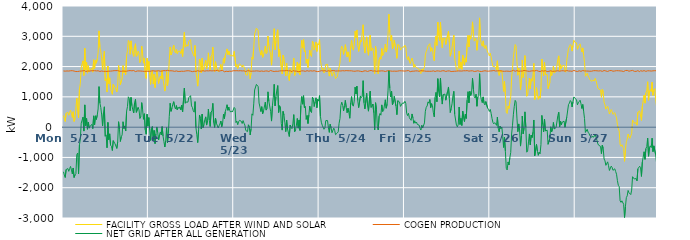
| Category | FACILITY GROSS LOAD AFTER WIND AND SOLAR | COGEN PRODUCTION | NET GRID AFTER ALL GENERATION |
|---|---|---|---|
|  Mon  5/21 | 381 | 1855 | -1474 |
|  Mon  5/21 | 284 | 1862 | -1578 |
|  Mon  5/21 | 187 | 1849 | -1662 |
|  Mon  5/21 | 459 | 1859 | -1400 |
|  Mon  5/21 | 466 | 1855 | -1389 |
|  Mon  5/21 | 488 | 1856 | -1368 |
|  Mon  5/21 | 393 | 1852 | -1459 |
|  Mon  5/21 | 490 | 1856 | -1366 |
|  Mon  5/21 | 565 | 1862 | -1297 |
|  Mon  5/21 | 443 | 1862 | -1419 |
|  Mon  5/21 | 321 | 1864 | -1543 |
|  Mon  5/21 | 509 | 1858 | -1349 |
|  Mon  5/21 | 189 | 1851 | -1662 |
|  Mon  5/21 | 278 | 1855 | -1577 |
|  Mon  5/21 | 300 | 1836 | -1536 |
|  Mon  5/21 | 953 | 1861 | -908 |
|  Mon  5/21 | 983 | 1837 | -854 |
|  Mon  5/21 | 306 | 1846 | -1540 |
|  Mon  5/21 | 1262 | 1847 | -585 |
|  Mon  5/21 | 1442 | 1836 | -394 |
|  Mon  5/21 | 1984 | 1852 | 132 |
|  Mon  5/21 | 2089 | 1857 | 232 |
|  Mon  5/21 | 2190 | 1859 | 331 |
|  Mon  5/21 | 1706 | 1836 | -130 |
|  Mon  5/21 | 2603 | 1868 | 735 |
|  Mon  5/21 | 1881 | 1834 | 47 |
|  Mon  5/21 | 2145 | 1858 | 287 |
|  Mon  5/21 | 1782 | 1852 | -70 |
|  Mon  5/21 | 2028 | 1860 | 168 |
|  Mon  5/21 | 1820 | 1853 | -33 |
|  Mon  5/21 | 1887 | 1853 | 34 |
|  Mon  5/21 | 1921 | 1858 | 63 |
|  Mon  5/21 | 1955 | 1866 | 89 |
|  Mon  5/21 | 1816 | 1866 | -50 |
|  Mon  5/21 | 2226 | 1853 | 373 |
|  Mon  5/21 | 1936 | 1864 | 72 |
|  Mon  5/21 | 2207 | 1833 | 374 |
|  Mon  5/21 | 2111 | 1857 | 254 |
|  Mon  5/21 | 2253 | 1857 | 396 |
|  Mon  5/21 | 2461 | 1861 | 600 |
|  Mon  5/21 | 3179 | 1841 | 1338 |
|  Mon  5/21 | 2633 | 1839 | 794 |
|  Mon  5/21 | 2508 | 1859 | 649 |
|  Mon  5/21 | 2255 | 1853 | 402 |
|  Mon  5/21 | 1891 | 1854 | 37 |
|  Mon  5/21 | 2311 | 1843 | 468 |
|  Mon  5/21 | 2511 | 1839 | 672 |
|  Mon  5/21 | 1541 | 1842 | -301 |
|  Mon  5/21 | 1598 | 1854 | -256 |
|  Mon  5/21 | 1159 | 1840 | -681 |
|  Mon  5/21 | 2019 | 1863 | 156 |
|  Mon  5/21 | 1434 | 1849 | -415 |
|  Mon  5/21 | 1627 | 1848 | -221 |
|  Mon  5/21 | 1253 | 1850 | -597 |
|  Mon  5/21 | 1220 | 1853 | -633 |
|  Mon  5/21 | 1085 | 1856 | -771 |
|  Mon  5/21 | 1417 | 1861 | -444 |
|  Mon  5/21 | 1424 | 1865 | -441 |
|  Mon  5/21 | 1314 | 1863 | -549 |
|  Mon  5/21 | 1326 | 1866 | -540 |
|  Mon  5/21 | 1162 | 1865 | -703 |
|  Mon  5/21 | 1374 | 1867 | -493 |
|  Mon  5/21 | 2040 | 1861 | 179 |
|  Mon  5/21 | 1783 | 1848 | -65 |
|  Mon  5/21 | 1401 | 1875 | -474 |
|  Mon  5/21 | 1523 | 1844 | -321 |
|  Mon  5/21 | 1589 | 1845 | -256 |
|  Mon  5/21 | 2032 | 1854 | 178 |
|  Mon  5/21 | 1793 | 1838 | -45 |
|  Mon  5/21 | 1886 | 1846 | 40 |
|  Mon  5/21 | 1734 | 1862 | -128 |
|  Mon  5/21 | 2368 | 1847 | 521 |
|  Mon  5/21 | 2520 | 1842 | 678 |
|  Mon  5/21 | 2863 | 1861 | 1002 |
|  Mon  5/21 | 2810 | 1856 | 954 |
|  Mon  5/21 | 2408 | 1867 | 541 |
|  Mon  5/21 | 2848 | 1866 | 982 |
|  Mon  5/21 | 2566 | 1860 | 706 |
|  Mon  5/21 | 2430 | 1859 | 571 |
|  Mon  5/21 | 2337 | 1869 | 468 |
|  Mon  5/21 | 2662 | 1853 | 809 |
|  Mon  5/21 | 2753 | 1835 | 918 |
|  Mon  5/21 | 2336 | 1847 | 489 |
|  Mon  5/21 | 2372 | 1854 | 518 |
|  Mon  5/21 | 2509 | 1857 | 652 |
|  Mon  5/21 | 2424 | 1855 | 569 |
|  Mon  5/21 | 2135 | 1847 | 288 |
|  Mon  5/21 | 2207 | 1852 | 355 |
|  Mon  5/21 | 2677 | 1868 | 809 |
|  Mon  5/21 | 2426 | 1847 | 579 |
|  Mon  5/21 | 2113 | 1853 | 260 |
|  Mon  5/21 | 2284 | 1841 | 443 |
|  Mon  5/21 | 1768 | 1857 | -89 |
|  Mon  5/21 | 1609 | 1844 | -235 |
|  Mon  5/21 | 2277 | 1849 | 428 |
|  Mon  5/21 | 1873 | 1844 | 29 |
|  Tue  5/22 | 2170 | 1855 | 315 |
|  Tue  5/22 | 1755 | 1843 | -88 |
|  Tue  5/22 | 1413 | 1852 | -439 |
|  Tue  5/22 | 1816 | 1855 | -39 |
|  Tue  5/22 | 1872 | 1850 | 22 |
|  Tue  5/22 | 1426 | 1862 | -436 |
|  Tue  5/22 | 1746 | 1854 | -108 |
|  Tue  5/22 | 1307 | 1850 | -543 |
|  Tue  5/22 | 1626 | 1845 | -219 |
|  Tue  5/22 | 1860 | 1854 | 6 |
|  Tue  5/22 | 1682 | 1859 | -177 |
|  Tue  5/22 | 1439 | 1863 | -424 |
|  Tue  5/22 | 1604 | 1854 | -250 |
|  Tue  5/22 | 1688 | 1846 | -158 |
|  Tue  5/22 | 1587 | 1847 | -260 |
|  Tue  5/22 | 1871 | 1854 | 17 |
|  Tue  5/22 | 1568 | 1861 | -293 |
|  Tue  5/22 | 1387 | 1866 | -479 |
|  Tue  5/22 | 1191 | 1847 | -656 |
|  Tue  5/22 | 1420 | 1861 | -441 |
|  Tue  5/22 | 1832 | 1848 | -16 |
|  Tue  5/22 | 1361 | 1875 | -514 |
|  Tue  5/22 | 1625 | 1846 | -221 |
|  Tue  5/22 | 2215 | 1860 | 355 |
|  Tue  5/22 | 2647 | 1859 | 788 |
|  Tue  5/22 | 2383 | 1861 | 522 |
|  Tue  5/22 | 2468 | 1843 | 625 |
|  Tue  5/22 | 2615 | 1856 | 759 |
|  Tue  5/22 | 2710 | 1869 | 841 |
|  Tue  5/22 | 2516 | 1842 | 674 |
|  Tue  5/22 | 2457 | 1858 | 599 |
|  Tue  5/22 | 2569 | 1856 | 713 |
|  Tue  5/22 | 2429 | 1859 | 570 |
|  Tue  5/22 | 2497 | 1839 | 658 |
|  Tue  5/22 | 2477 | 1863 | 614 |
|  Tue  5/22 | 2511 | 1840 | 671 |
|  Tue  5/22 | 2429 | 1860 | 569 |
|  Tue  5/22 | 2575 | 1847 | 728 |
|  Tue  5/22 | 2333 | 1832 | 501 |
|  Tue  5/22 | 2350 | 1843 | 507 |
|  Tue  5/22 | 3133 | 1844 | 1289 |
|  Tue  5/22 | 2641 | 1852 | 789 |
|  Tue  5/22 | 2677 | 1847 | 830 |
|  Tue  5/22 | 2720 | 1862 | 858 |
|  Tue  5/22 | 2671 | 1846 | 825 |
|  Tue  5/22 | 2835 | 1861 | 974 |
|  Tue  5/22 | 2810 | 1839 | 971 |
|  Tue  5/22 | 2888 | 1849 | 1039 |
|  Tue  5/22 | 2555 | 1853 | 702 |
|  Tue  5/22 | 2483 | 1833 | 650 |
|  Tue  5/22 | 2402 | 1860 | 542 |
|  Tue  5/22 | 2342 | 1847 | 495 |
|  Tue  5/22 | 2698 | 1854 | 844 |
|  Tue  5/22 | 1824 | 1841 | -17 |
|  Tue  5/22 | 1605 | 1856 | -251 |
|  Tue  5/22 | 1354 | 1864 | -510 |
|  Tue  5/22 | 1779 | 1861 | -82 |
|  Tue  5/22 | 2247 | 1846 | 401 |
|  Tue  5/22 | 2132 | 1848 | 284 |
|  Tue  5/22 | 1788 | 1850 | -62 |
|  Tue  5/22 | 2278 | 1847 | 431 |
|  Tue  5/22 | 1850 | 1863 | -13 |
|  Tue  5/22 | 1940 | 1856 | 84 |
|  Tue  5/22 | 2101 | 1850 | 251 |
|  Tue  5/22 | 2205 | 1865 | 340 |
|  Tue  5/22 | 1930 | 1862 | 68 |
|  Tue  5/22 | 2073 | 1864 | 209 |
|  Tue  5/22 | 2453 | 1857 | 596 |
|  Tue  5/22 | 2085 | 1856 | 229 |
|  Tue  5/22 | 1886 | 1864 | 22 |
|  Tue  5/22 | 2339 | 1841 | 498 |
|  Tue  5/22 | 2391 | 1857 | 534 |
|  Tue  5/22 | 2642 | 1857 | 785 |
|  Tue  5/22 | 2011 | 1863 | 148 |
|  Tue  5/22 | 1838 | 1846 | -8 |
|  Tue  5/22 | 2160 | 1862 | 298 |
|  Tue  5/22 | 1985 | 1854 | 131 |
|  Tue  5/22 | 1997 | 1878 | 119 |
|  Tue  5/22 | 1834 | 1859 | -25 |
|  Tue  5/22 | 1892 | 1849 | 43 |
|  Tue  5/22 | 1948 | 1846 | 102 |
|  Tue  5/22 | 2068 | 1865 | 203 |
|  Tue  5/22 | 1872 | 1858 | 14 |
|  Tue  5/22 | 2003 | 1871 | 132 |
|  Tue  5/22 | 2283 | 1852 | 431 |
|  Tue  5/22 | 2113 | 1830 | 283 |
|  Tue  5/22 | 2372 | 1861 | 511 |
|  Tue  5/22 | 2461 | 1845 | 616 |
|  Tue  5/22 | 2583 | 1844 | 739 |
|  Tue  5/22 | 2394 | 1838 | 556 |
|  Tue  5/22 | 2515 | 1854 | 661 |
|  Tue  5/22 | 2396 | 1847 | 549 |
|  Tue  5/22 | 2342 | 1846 | 496 |
|  Tue  5/22 | 2379 | 1844 | 535 |
|  Tue  5/22 | 2360 | 1862 | 498 |
|  Tue  5/22 | 2338 | 1863 | 475 |
|  Wed  5/23 | 2503 | 1853 | 650 |
|  Wed  5/23 | 2472 | 1861 | 611 |
|  Wed  5/23 | 1994 | 1844 | 150 |
|  Wed  5/23 | 2066 | 1864 | 202 |
|  Wed  5/23 | 1937 | 1857 | 80 |
|  Wed  5/23 | 2038 | 1859 | 179 |
|  Wed  5/23 | 2091 | 1867 | 224 |
|  Wed  5/23 | 2103 | 1864 | 239 |
|  Wed  5/23 | 2037 | 1842 | 195 |
|  Wed  5/23 | 1976 | 1856 | 120 |
|  Wed  5/23 | 2056 | 1840 | 216 |
|  Wed  5/23 | 1992 | 1860 | 132 |
|  Wed  5/23 | 1913 | 1843 | 70 |
|  Wed  5/23 | 1728 | 1836 | -108 |
|  Wed  5/23 | 1728 | 1840 | -112 |
|  Wed  5/23 | 1716 | 1864 | -148 |
|  Wed  5/23 | 1930 | 1853 | 77 |
|  Wed  5/23 | 1863 | 1858 | 5 |
|  Wed  5/23 | 1596 | 1853 | -257 |
|  Wed  5/23 | 1793 | 1845 | -52 |
|  Wed  5/23 | 2305 | 1866 | 439 |
|  Wed  5/23 | 2243 | 1851 | 392 |
|  Wed  5/23 | 2630 | 1862 | 768 |
|  Wed  5/23 | 3078 | 1851 | 1227 |
|  Wed  5/23 | 3089 | 1876 | 1213 |
|  Wed  5/23 | 3269 | 1858 | 1411 |
|  Wed  5/23 | 3245 | 1843 | 1402 |
|  Wed  5/23 | 3190 | 1853 | 1337 |
|  Wed  5/23 | 2647 | 1851 | 796 |
|  Wed  5/23 | 2510 | 1844 | 666 |
|  Wed  5/23 | 2376 | 1859 | 517 |
|  Wed  5/23 | 2529 | 1854 | 675 |
|  Wed  5/23 | 2306 | 1864 | 442 |
|  Wed  5/23 | 2379 | 1841 | 538 |
|  Wed  5/23 | 2350 | 1844 | 506 |
|  Wed  5/23 | 2677 | 1853 | 824 |
|  Wed  5/23 | 2428 | 1866 | 562 |
|  Wed  5/23 | 2464 | 1855 | 609 |
|  Wed  5/23 | 3009 | 1843 | 1166 |
|  Wed  5/23 | 2689 | 1838 | 851 |
|  Wed  5/23 | 2721 | 1839 | 882 |
|  Wed  5/23 | 2392 | 1870 | 522 |
|  Wed  5/23 | 2047 | 1847 | 200 |
|  Wed  5/23 | 2552 | 1849 | 703 |
|  Wed  5/23 | 2860 | 1868 | 992 |
|  Wed  5/23 | 3251 | 1837 | 1414 |
|  Wed  5/23 | 2560 | 1856 | 704 |
|  Wed  5/23 | 2844 | 1847 | 997 |
|  Wed  5/23 | 3091 | 1868 | 1223 |
|  Wed  5/23 | 3216 | 1843 | 1373 |
|  Wed  5/23 | 2331 | 1847 | 484 |
|  Wed  5/23 | 2563 | 1854 | 709 |
|  Wed  5/23 | 2532 | 1864 | 668 |
|  Wed  5/23 | 1977 | 1860 | 117 |
|  Wed  5/23 | 1755 | 1853 | -98 |
|  Wed  5/23 | 2379 | 1859 | 520 |
|  Wed  5/23 | 2264 | 1866 | 398 |
|  Wed  5/23 | 2002 | 1860 | 142 |
|  Wed  5/23 | 1692 | 1840 | -148 |
|  Wed  5/23 | 2108 | 1873 | 235 |
|  Wed  5/23 | 1797 | 1859 | -62 |
|  Wed  5/23 | 1781 | 1859 | -78 |
|  Wed  5/23 | 1538 | 1846 | -308 |
|  Wed  5/23 | 1930 | 1860 | 70 |
|  Wed  5/23 | 1852 | 1854 | -2 |
|  Wed  5/23 | 1780 | 1831 | -51 |
|  Wed  5/23 | 1974 | 1866 | 108 |
|  Wed  5/23 | 2280 | 1867 | 413 |
|  Wed  5/23 | 1704 | 1853 | -149 |
|  Wed  5/23 | 1756 | 1845 | -89 |
|  Wed  5/23 | 1918 | 1849 | 69 |
|  Wed  5/23 | 2147 | 1861 | 286 |
|  Wed  5/23 | 1799 | 1833 | -34 |
|  Wed  5/23 | 2093 | 1856 | 237 |
|  Wed  5/23 | 1729 | 1838 | -109 |
|  Wed  5/23 | 2551 | 1839 | 712 |
|  Wed  5/23 | 2870 | 1859 | 1011 |
|  Wed  5/23 | 2610 | 1852 | 758 |
|  Wed  5/23 | 2895 | 1856 | 1039 |
|  Wed  5/23 | 2486 | 1848 | 638 |
|  Wed  5/23 | 2529 | 1843 | 686 |
|  Wed  5/23 | 2108 | 1853 | 255 |
|  Wed  5/23 | 2247 | 1864 | 383 |
|  Wed  5/23 | 1970 | 1850 | 120 |
|  Wed  5/23 | 2253 | 1848 | 405 |
|  Wed  5/23 | 2545 | 1852 | 693 |
|  Wed  5/23 | 2384 | 1861 | 523 |
|  Wed  5/23 | 2332 | 1852 | 480 |
|  Wed  5/23 | 2838 | 1851 | 987 |
|  Wed  5/23 | 2770 | 1848 | 922 |
|  Wed  5/23 | 2544 | 1863 | 681 |
|  Wed  5/23 | 2685 | 1846 | 839 |
|  Wed  5/23 | 2812 | 1844 | 968 |
|  Wed  5/23 | 2500 | 1859 | 641 |
|  Wed  5/23 | 2755 | 1833 | 922 |
|  Wed  5/23 | 2717 | 1858 | 859 |
|  Thu  5/24 | 2889 | 1846 | 1043 |
|  Thu  5/24 | 2207 | 1854 | 353 |
|  Thu  5/24 | 2028 | 1865 | 163 |
|  Thu  5/24 | 1899 | 1834 | 65 |
|  Thu  5/24 | 1946 | 1856 | 90 |
|  Thu  5/24 | 1786 | 1857 | -71 |
|  Thu  5/24 | 1833 | 1865 | -32 |
|  Thu  5/24 | 2069 | 1854 | 215 |
|  Thu  5/24 | 2039 | 1845 | 194 |
|  Thu  5/24 | 2072 | 1854 | 218 |
|  Thu  5/24 | 1836 | 1862 | -26 |
|  Thu  5/24 | 1686 | 1858 | -172 |
|  Thu  5/24 | 1942 | 1848 | 94 |
|  Thu  5/24 | 1833 | 1856 | -23 |
|  Thu  5/24 | 1681 | 1866 | -185 |
|  Thu  5/24 | 1685 | 1846 | -161 |
|  Thu  5/24 | 1836 | 1869 | -33 |
|  Thu  5/24 | 1747 | 1854 | -107 |
|  Thu  5/24 | 1604 | 1853 | -249 |
|  Thu  5/24 | 1600 | 1856 | -256 |
|  Thu  5/24 | 1664 | 1855 | -191 |
|  Thu  5/24 | 1691 | 1844 | -153 |
|  Thu  5/24 | 1984 | 1857 | 127 |
|  Thu  5/24 | 2136 | 1849 | 287 |
|  Thu  5/24 | 2568 | 1855 | 713 |
|  Thu  5/24 | 2673 | 1849 | 824 |
|  Thu  5/24 | 2586 | 1864 | 722 |
|  Thu  5/24 | 2402 | 1865 | 537 |
|  Thu  5/24 | 2566 | 1858 | 708 |
|  Thu  5/24 | 2724 | 1840 | 884 |
|  Thu  5/24 | 2515 | 1867 | 648 |
|  Thu  5/24 | 2318 | 1842 | 476 |
|  Thu  5/24 | 2486 | 1862 | 624 |
|  Thu  5/24 | 2335 | 1845 | 490 |
|  Thu  5/24 | 2155 | 1861 | 294 |
|  Thu  5/24 | 2651 | 1852 | 799 |
|  Thu  5/24 | 2867 | 1859 | 1008 |
|  Thu  5/24 | 2600 | 1868 | 732 |
|  Thu  5/24 | 2540 | 1848 | 692 |
|  Thu  5/24 | 2706 | 1848 | 858 |
|  Thu  5/24 | 3166 | 1846 | 1320 |
|  Thu  5/24 | 2958 | 1863 | 1095 |
|  Thu  5/24 | 3209 | 1857 | 1352 |
|  Thu  5/24 | 2718 | 1840 | 878 |
|  Thu  5/24 | 2501 | 1856 | 645 |
|  Thu  5/24 | 2474 | 1860 | 614 |
|  Thu  5/24 | 2873 | 1843 | 1030 |
|  Thu  5/24 | 2817 | 1844 | 973 |
|  Thu  5/24 | 2849 | 1831 | 1018 |
|  Thu  5/24 | 3381 | 1847 | 1534 |
|  Thu  5/24 | 2657 | 1855 | 802 |
|  Thu  5/24 | 2446 | 1843 | 603 |
|  Thu  5/24 | 2476 | 1859 | 617 |
|  Thu  5/24 | 2980 | 1864 | 1116 |
|  Thu  5/24 | 2544 | 1838 | 706 |
|  Thu  5/24 | 2374 | 1847 | 527 |
|  Thu  5/24 | 2386 | 1859 | 527 |
|  Thu  5/24 | 3037 | 1851 | 1186 |
|  Thu  5/24 | 2522 | 1872 | 650 |
|  Thu  5/24 | 2542 | 1853 | 689 |
|  Thu  5/24 | 2614 | 1850 | 764 |
|  Thu  5/24 | 2340 | 1866 | 474 |
|  Thu  5/24 | 1765 | 1858 | -93 |
|  Thu  5/24 | 2667 | 1861 | 806 |
|  Thu  5/24 | 2440 | 1843 | 597 |
|  Thu  5/24 | 1874 | 1854 | 20 |
|  Thu  5/24 | 1760 | 1853 | -93 |
|  Thu  5/24 | 2227 | 1863 | 364 |
|  Thu  5/24 | 2305 | 1853 | 452 |
|  Thu  5/24 | 2242 | 1848 | 394 |
|  Thu  5/24 | 2594 | 1859 | 735 |
|  Thu  5/24 | 2364 | 1850 | 514 |
|  Thu  5/24 | 2401 | 1853 | 548 |
|  Thu  5/24 | 2399 | 1871 | 528 |
|  Thu  5/24 | 2740 | 1837 | 903 |
|  Thu  5/24 | 2479 | 1855 | 624 |
|  Thu  5/24 | 2614 | 1858 | 756 |
|  Thu  5/24 | 3043 | 1846 | 1197 |
|  Thu  5/24 | 3726 | 1867 | 1859 |
|  Thu  5/24 | 3126 | 1842 | 1284 |
|  Thu  5/24 | 2850 | 1853 | 997 |
|  Thu  5/24 | 3039 | 1847 | 1192 |
|  Thu  5/24 | 2586 | 1846 | 740 |
|  Thu  5/24 | 2668 | 1850 | 818 |
|  Thu  5/24 | 2868 | 1850 | 1018 |
|  Thu  5/24 | 2855 | 1864 | 991 |
|  Thu  5/24 | 2539 | 1846 | 693 |
|  Thu  5/24 | 2273 | 1861 | 412 |
|  Thu  5/24 | 2725 | 1851 | 874 |
|  Thu  5/24 | 2738 | 1859 | 879 |
|  Thu  5/24 | 2691 | 1861 | 830 |
|  Thu  5/24 | 2543 | 1857 | 686 |
|  Thu  5/24 | 2591 | 1859 | 732 |
|  Thu  5/24 | 2640 | 1850 | 790 |
|  Thu  5/24 | 2618 | 1856 | 762 |
|  Thu  5/24 | 2646 | 1852 | 794 |
|  Fri  5/25 | 2705 | 1851 | 854 |
|  Fri  5/25 | 2647 | 1863 | 784 |
|  Fri  5/25 | 2319 | 1860 | 459 |
|  Fri  5/25 | 2233 | 1852 | 381 |
|  Fri  5/25 | 2327 | 1869 | 458 |
|  Fri  5/25 | 2188 | 1871 | 317 |
|  Fri  5/25 | 2096 | 1832 | 264 |
|  Fri  5/25 | 2071 | 1846 | 225 |
|  Fri  5/25 | 2283 | 1847 | 436 |
|  Fri  5/25 | 2173 | 1865 | 308 |
|  Fri  5/25 | 1976 | 1848 | 128 |
|  Fri  5/25 | 2069 | 1859 | 210 |
|  Fri  5/25 | 1988 | 1857 | 131 |
|  Fri  5/25 | 2000 | 1831 | 169 |
|  Fri  5/25 | 1946 | 1857 | 89 |
|  Fri  5/25 | 1921 | 1852 | 69 |
|  Fri  5/25 | 1910 | 1844 | 66 |
|  Fri  5/25 | 1830 | 1864 | -34 |
|  Fri  5/25 | 1768 | 1864 | -96 |
|  Fri  5/25 | 1922 | 1862 | 60 |
|  Fri  5/25 | 1830 | 1859 | -29 |
|  Fri  5/25 | 1805 | 1861 | -56 |
|  Fri  5/25 | 1994 | 1854 | 140 |
|  Fri  5/25 | 2385 | 1860 | 525 |
|  Fri  5/25 | 2500 | 1845 | 655 |
|  Fri  5/25 | 2568 | 1869 | 699 |
|  Fri  5/25 | 2681 | 1847 | 834 |
|  Fri  5/25 | 2658 | 1867 | 791 |
|  Fri  5/25 | 2756 | 1845 | 911 |
|  Fri  5/25 | 2500 | 1853 | 647 |
|  Fri  5/25 | 2624 | 1846 | 778 |
|  Fri  5/25 | 2573 | 1863 | 710 |
|  Fri  5/25 | 2333 | 1858 | 475 |
|  Fri  5/25 | 2194 | 1853 | 341 |
|  Fri  5/25 | 2824 | 1838 | 986 |
|  Fri  5/25 | 3006 | 1859 | 1147 |
|  Fri  5/25 | 2699 | 1858 | 841 |
|  Fri  5/25 | 3467 | 1867 | 1600 |
|  Fri  5/25 | 3025 | 1854 | 1171 |
|  Fri  5/25 | 2855 | 1853 | 1002 |
|  Fri  5/25 | 3463 | 1844 | 1619 |
|  Fri  5/25 | 2874 | 1868 | 1006 |
|  Fri  5/25 | 2622 | 1860 | 762 |
|  Fri  5/25 | 2937 | 1863 | 1074 |
|  Fri  5/25 | 2952 | 1861 | 1091 |
|  Fri  5/25 | 2939 | 1848 | 1091 |
|  Fri  5/25 | 2729 | 1839 | 890 |
|  Fri  5/25 | 2729 | 1838 | 891 |
|  Fri  5/25 | 3039 | 1855 | 1184 |
|  Fri  5/25 | 3173 | 1847 | 1326 |
|  Fri  5/25 | 2802 | 1857 | 945 |
|  Fri  5/25 | 2341 | 1857 | 484 |
|  Fri  5/25 | 2454 | 1837 | 617 |
|  Fri  5/25 | 2630 | 1860 | 770 |
|  Fri  5/25 | 2873 | 1841 | 1032 |
|  Fri  5/25 | 3037 | 1855 | 1182 |
|  Fri  5/25 | 2272 | 1846 | 426 |
|  Fri  5/25 | 2258 | 1861 | 397 |
|  Fri  5/25 | 1905 | 1849 | 56 |
|  Fri  5/25 | 1864 | 1854 | 10 |
|  Fri  5/25 | 1949 | 1857 | 92 |
|  Fri  5/25 | 2513 | 1849 | 664 |
|  Fri  5/25 | 1942 | 1854 | 88 |
|  Fri  5/25 | 2142 | 1853 | 289 |
|  Fri  5/25 | 1907 | 1852 | 55 |
|  Fri  5/25 | 2383 | 1854 | 529 |
|  Fri  5/25 | 2405 | 1862 | 543 |
|  Fri  5/25 | 2050 | 1863 | 187 |
|  Fri  5/25 | 2289 | 1860 | 429 |
|  Fri  5/25 | 2148 | 1861 | 287 |
|  Fri  5/25 | 2759 | 1866 | 893 |
|  Fri  5/25 | 3031 | 1860 | 1171 |
|  Fri  5/25 | 2650 | 1850 | 800 |
|  Fri  5/25 | 3028 | 1846 | 1182 |
|  Fri  5/25 | 2904 | 1858 | 1046 |
|  Fri  5/25 | 2995 | 1850 | 1145 |
|  Fri  5/25 | 3476 | 1860 | 1616 |
|  Fri  5/25 | 3110 | 1854 | 1256 |
|  Fri  5/25 | 2840 | 1839 | 1001 |
|  Fri  5/25 | 2813 | 1852 | 961 |
|  Fri  5/25 | 2934 | 1846 | 1088 |
|  Fri  5/25 | 2537 | 1847 | 690 |
|  Fri  5/25 | 2858 | 1862 | 996 |
|  Fri  5/25 | 2892 | 1852 | 1040 |
|  Fri  5/25 | 3608 | 1843 | 1765 |
|  Fri  5/25 | 2901 | 1852 | 1049 |
|  Fri  5/25 | 2741 | 1837 | 904 |
|  Fri  5/25 | 2670 | 1859 | 811 |
|  Fri  5/25 | 2849 | 1850 | 999 |
|  Fri  5/25 | 2653 | 1861 | 792 |
|  Fri  5/25 | 2595 | 1862 | 733 |
|  Fri  5/25 | 2701 | 1855 | 846 |
|  Fri  5/25 | 2726 | 1851 | 875 |
|  Fri  5/25 | 2475 | 1847 | 628 |
|  Fri  5/25 | 2437 | 1848 | 589 |
|  Fri  5/25 | 2349 | 1832 | 517 |
|  Sat  5/26 | 2441 | 1855 | 586 |
|  Sat  5/26 | 2313 | 1861 | 452 |
|  Sat  5/26 | 2142 | 1859 | 283 |
|  Sat  5/26 | 1999 | 1844 | 155 |
|  Sat  5/26 | 1978 | 1870 | 108 |
|  Sat  5/26 | 2005 | 1856 | 149 |
|  Sat  5/26 | 1968 | 1853 | 115 |
|  Sat  5/26 | 1896 | 1837 | 59 |
|  Sat  5/26 | 2190 | 1859 | 331 |
|  Sat  5/26 | 1808 | 1845 | -37 |
|  Sat  5/26 | 1708 | 1862 | -154 |
|  Sat  5/26 | 1877 | 1845 | 32 |
|  Sat  5/26 | 1812 | 1860 | -48 |
|  Sat  5/26 | 1870 | 1866 | 4 |
|  Sat  5/26 | 1544 | 1847 | -303 |
|  Sat  5/26 | 1182 | 1853 | -671 |
|  Sat  5/26 | 1514 | 1843 | -329 |
|  Sat  5/26 | 1073 | 1870 | -797 |
|  Sat  5/26 | 492 | 1850 | -1358 |
|  Sat  5/26 | 450 | 1864 | -1414 |
|  Sat  5/26 | 698 | 1848 | -1150 |
|  Sat  5/26 | 619 | 1866 | -1247 |
|  Sat  5/26 | 834 | 1841 | -1007 |
|  Sat  5/26 | 1012 | 1850 | -838 |
|  Sat  5/26 | 1626 | 1852 | -226 |
|  Sat  5/26 | 1928 | 1865 | 63 |
|  Sat  5/26 | 2303 | 1877 | 426 |
|  Sat  5/26 | 2539 | 1852 | 687 |
|  Sat  5/26 | 2728 | 1844 | 884 |
|  Sat  5/26 | 2674 | 1842 | 832 |
|  Sat  5/26 | 2165 | 1867 | 298 |
|  Sat  5/26 | 1714 | 1864 | -150 |
|  Sat  5/26 | 1952 | 1846 | 106 |
|  Sat  5/26 | 1745 | 1860 | -115 |
|  Sat  5/26 | 1225 | 1851 | -626 |
|  Sat  5/26 | 1569 | 1846 | -277 |
|  Sat  5/26 | 2219 | 1852 | 367 |
|  Sat  5/26 | 1638 | 1858 | -220 |
|  Sat  5/26 | 1841 | 1873 | -32 |
|  Sat  5/26 | 2364 | 1859 | 505 |
|  Sat  5/26 | 1860 | 1861 | -1 |
|  Sat  5/26 | 1016 | 1843 | -827 |
|  Sat  5/26 | 1058 | 1850 | -792 |
|  Sat  5/26 | 1364 | 1851 | -487 |
|  Sat  5/26 | 1618 | 1842 | -224 |
|  Sat  5/26 | 1266 | 1851 | -585 |
|  Sat  5/26 | 1596 | 1855 | -259 |
|  Sat  5/26 | 1518 | 1862 | -344 |
|  Sat  5/26 | 1694 | 1860 | -166 |
|  Sat  5/26 | 2104 | 1868 | 236 |
|  Sat  5/26 | 911 | 1855 | -944 |
|  Sat  5/26 | 954 | 1866 | -912 |
|  Sat  5/26 | 1304 | 1874 | -570 |
|  Sat  5/26 | 1066 | 1862 | -796 |
|  Sat  5/26 | 918 | 1848 | -930 |
|  Sat  5/26 | 1027 | 1854 | -827 |
|  Sat  5/26 | 954 | 1835 | -881 |
|  Sat  5/26 | 1281 | 1853 | -572 |
|  Sat  5/26 | 2249 | 1862 | 387 |
|  Sat  5/26 | 1943 | 1859 | 84 |
|  Sat  5/26 | 1694 | 1851 | -157 |
|  Sat  5/26 | 2138 | 1870 | 268 |
|  Sat  5/26 | 1739 | 1864 | -125 |
|  Sat  5/26 | 1707 | 1848 | -141 |
|  Sat  5/26 | 1735 | 1836 | -101 |
|  Sat  5/26 | 1272 | 1839 | -567 |
|  Sat  5/26 | 1301 | 1844 | -543 |
|  Sat  5/26 | 1474 | 1843 | -369 |
|  Sat  5/26 | 1872 | 1861 | 11 |
|  Sat  5/26 | 1701 | 1855 | -154 |
|  Sat  5/26 | 1772 | 1841 | -69 |
|  Sat  5/26 | 2019 | 1864 | 155 |
|  Sat  5/26 | 1789 | 1848 | -59 |
|  Sat  5/26 | 1812 | 1848 | -36 |
|  Sat  5/26 | 1839 | 1853 | -14 |
|  Sat  5/26 | 1811 | 1857 | -46 |
|  Sat  5/26 | 2243 | 1862 | 381 |
|  Sat  5/26 | 2354 | 1861 | 493 |
|  Sat  5/26 | 1859 | 1847 | 12 |
|  Sat  5/26 | 2063 | 1862 | 201 |
|  Sat  5/26 | 1940 | 1860 | 80 |
|  Sat  5/26 | 2022 | 1854 | 168 |
|  Sat  5/26 | 2015 | 1863 | 152 |
|  Sat  5/26 | 2042 | 1845 | 197 |
|  Sat  5/26 | 1848 | 1850 | -2 |
|  Sat  5/26 | 1814 | 1840 | -26 |
|  Sat  5/26 | 2197 | 1869 | 328 |
|  Sat  5/26 | 2199 | 1858 | 341 |
|  Sat  5/26 | 2604 | 1854 | 750 |
|  Sat  5/26 | 2650 | 1857 | 793 |
|  Sat  5/26 | 2729 | 1851 | 878 |
|  Sat  5/26 | 2691 | 1852 | 839 |
|  Sat  5/26 | 2511 | 1844 | 667 |
|  Sat  5/26 | 2694 | 1858 | 836 |
|  Sat  5/26 | 2870 | 1873 | 997 |
|  Sat  5/26 | 2806 | 1849 | 957 |
|  Sun  5/27 | 2839 | 1850 | 989 |
|  Sun  5/27 | 2777 | 1871 | 906 |
|  Sun  5/27 | 2573 | 1837 | 736 |
|  Sun  5/27 | 2658 | 1853 | 805 |
|  Sun  5/27 | 2706 | 1861 | 845 |
|  Sun  5/27 | 2750 | 1862 | 888 |
|  Sun  5/27 | 2618 | 1843 | 775 |
|  Sun  5/27 | 2487 | 1870 | 617 |
|  Sun  5/27 | 2616 | 1869 | 747 |
|  Sun  5/27 | 2372 | 1850 | 522 |
|  Sun  5/27 | 2140 | 1856 | 284 |
|  Sun  5/27 | 1679 | 1854 | -175 |
|  Sun  5/27 | 1677 | 1854 | -177 |
|  Sun  5/27 | 1780 | 1851 | -71 |
|  Sun  5/27 | 1684 | 1851 | -167 |
|  Sun  5/27 | 1635 | 1843 | -208 |
|  Sun  5/27 | 1570 | 1847 | -277 |
|  Sun  5/27 | 1572 | 1850 | -278 |
|  Sun  5/27 | 1510 | 1848 | -338 |
|  Sun  5/27 | 1554 | 1846 | -292 |
|  Sun  5/27 | 1527 | 1863 | -336 |
|  Sun  5/27 | 1528 | 1843 | -315 |
|  Sun  5/27 | 1613 | 1865 | -252 |
|  Sun  5/27 | 1531 | 1857 | -326 |
|  Sun  5/27 | 1512 | 1860 | -348 |
|  Sun  5/27 | 1289 | 1841 | -552 |
|  Sun  5/27 | 1254 | 1854 | -600 |
|  Sun  5/27 | 1267 | 1864 | -597 |
|  Sun  5/27 | 1226 | 1861 | -635 |
|  Sun  5/27 | 987 | 1861 | -874 |
|  Sun  5/27 | 1246 | 1842 | -596 |
|  Sun  5/27 | 1164 | 1870 | -706 |
|  Sun  5/27 | 818 | 1870 | -1052 |
|  Sun  5/27 | 736 | 1848 | -1112 |
|  Sun  5/27 | 594 | 1855 | -1261 |
|  Sun  5/27 | 566 | 1849 | -1283 |
|  Sun  5/27 | 693 | 1839 | -1146 |
|  Sun  5/27 | 581 | 1854 | -1273 |
|  Sun  5/27 | 434 | 1865 | -1431 |
|  Sun  5/27 | 438 | 1843 | -1405 |
|  Sun  5/27 | 582 | 1870 | -1288 |
|  Sun  5/27 | 515 | 1844 | -1329 |
|  Sun  5/27 | 421 | 1847 | -1426 |
|  Sun  5/27 | 419 | 1864 | -1445 |
|  Sun  5/27 | 479 | 1854 | -1375 |
|  Sun  5/27 | 386 | 1851 | -1465 |
|  Sun  5/27 | 310 | 1865 | -1555 |
|  Sun  5/27 | 84 | 1851 | -1767 |
|  Sun  5/27 | -58 | 1863 | -1921 |
|  Sun  5/27 | -128 | 1837 | -1965 |
|  Sun  5/27 | -575 | 1858 | -2433 |
|  Sun  5/27 | -633 | 1851 | -2484 |
|  Sun  5/27 | -580 | 1852 | -2432 |
|  Sun  5/27 | -582 | 1849 | -2431 |
|  Sun  5/27 | -711 | 1837 | -2548 |
|  Sun  5/27 | -1128 | 1856 | -2984 |
|  Sun  5/27 | -754 | 1869 | -2623 |
|  Sun  5/27 | -483 | 1845 | -2328 |
|  Sun  5/27 | -395 | 1873 | -2268 |
|  Sun  5/27 | -231 | 1859 | -2090 |
|  Sun  5/27 | -318 | 1847 | -2165 |
|  Sun  5/27 | -369 | 1827 | -2196 |
|  Sun  5/27 | -366 | 1861 | -2227 |
|  Sun  5/27 | -214 | 1865 | -2079 |
|  Sun  5/27 | 237 | 1873 | -1636 |
|  Sun  5/27 | 196 | 1863 | -1667 |
|  Sun  5/27 | 131 | 1843 | -1712 |
|  Sun  5/27 | 106 | 1849 | -1743 |
|  Sun  5/27 | 143 | 1841 | -1698 |
|  Sun  5/27 | 65 | 1839 | -1774 |
|  Sun  5/27 | 489 | 1866 | -1377 |
|  Sun  5/27 | 479 | 1858 | -1379 |
|  Sun  5/27 | 538 | 1830 | -1292 |
|  Sun  5/27 | 535 | 1865 | -1330 |
|  Sun  5/27 | 221 | 1848 | -1627 |
|  Sun  5/27 | 693 | 1848 | -1155 |
|  Sun  5/27 | 699 | 1853 | -1154 |
|  Sun  5/27 | 1053 | 1866 | -813 |
|  Sun  5/27 | 791 | 1854 | -1063 |
|  Sun  5/27 | 1132 | 1842 | -710 |
|  Sun  5/27 | 1197 | 1840 | -643 |
|  Sun  5/27 | 1498 | 1861 | -363 |
|  Sun  5/27 | 888 | 1849 | -961 |
|  Sun  5/27 | 1192 | 1859 | -667 |
|  Sun  5/27 | 1241 | 1858 | -617 |
|  Sun  5/27 | 1176 | 1852 | -676 |
|  Sun  5/27 | 1482 | 1847 | -365 |
|  Sun  5/27 | 1051 | 1859 | -808 |
|  Sun  5/27 | 1227 | 1845 | -618 |
|  Sun  5/27 | 1275 | 1865 | -590 |
|  Sun  5/27 | 937 | 1850 | -913 |
|  Sun  5/27 | 685 | 1860 | -1175 |